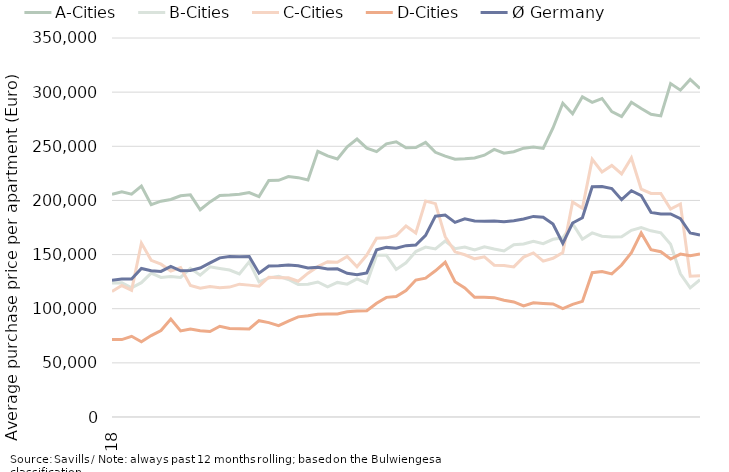
| Category | A-Cities | B-Cities | C-Cities | D-Cities | Ø Germany |
|---|---|---|---|---|---|
| 2018-12-31 | 205709.926 | 123816.667 | 115962.181 | 71467.809 | 126374.246 |
| 2019-01-31 | 207970.964 | 123948.37 | 121373.183 | 71491.123 | 127356.534 |
| 2019-02-28 | 205838.69 | 119321.336 | 117072.458 | 74553.964 | 127352.545 |
| 2019-03-31 | 213204.439 | 124066.253 | 160598.48 | 69477.262 | 137135.806 |
| 2019-04-30 | 196149.545 | 132897.412 | 144733.842 | 75180.853 | 135020.136 |
| 2019-05-31 | 199282.305 | 128866.915 | 141149.327 | 79868.433 | 134421.831 |
| 2019-06-30 | 200854.453 | 129700.035 | 134840.177 | 90421.619 | 138998.232 |
| 2019-07-31 | 204311.167 | 128898.092 | 137923.328 | 79521.239 | 135047.998 |
| 2019-08-31 | 205136.066 | 137236.968 | 121441.752 | 81329.034 | 135243.483 |
| 2019-09-30 | 191410.326 | 130947.49 | 118842.145 | 79686.579 | 137618.907 |
| 2019-10-31 | 198598.97 | 138644.708 | 120512.72 | 78885.294 | 142295.828 |
| 2019-11-30 | 204631.523 | 137216.505 | 119443.727 | 83770.905 | 146967.65 |
| 2019-12-31 | 204917.325 | 135712.797 | 119984.782 | 81747.066 | 148159.063 |
| 2020-01-31 | 205629.747 | 132191.235 | 122679.546 | 81411.791 | 147975.818 |
| 2020-02-29 | 207262.591 | 143343.382 | 121785.051 | 81275.114 | 148179.731 |
| 2020-03-31 | 203578.225 | 124803.659 | 120862.884 | 88906.886 | 132820.36 |
| 2020-04-30 | 218373.684 | 128391.295 | 129104.85 | 87164.683 | 139486.255 |
| 2020-05-31 | 218520.348 | 129898.327 | 128570.848 | 84357.807 | 139761.375 |
| 2020-06-30 | 222001.666 | 127016.066 | 128615.06 | 88580.501 | 140335.937 |
| 2020-07-31 | 221031.697 | 122454.934 | 125354.181 | 92485.072 | 139717.772 |
| 2020-08-31 | 218875.682 | 122654.081 | 132857.027 | 93475.061 | 137648.898 |
| 2020-09-30 | 245365.4 | 124663.85 | 138823.263 | 94907.263 | 138196.049 |
| 2020-10-31 | 241067.064 | 120210.857 | 143383.469 | 95170.767 | 136595.517 |
| 2020-11-30 | 238251.942 | 124288.802 | 142835.305 | 95228.113 | 136885.394 |
| 2020-12-31 | 249571.029 | 122663.257 | 148278.706 | 97223.978 | 132718.397 |
| 2021-01-31 | 256680.188 | 127597.81 | 138739.183 | 97788.194 | 131415.309 |
| 2021-02-28 | 248320.394 | 123624.953 | 149568.467 | 98065.992 | 133064.273 |
| 2021-03-31 | 245061.022 | 149465.306 | 165143.857 | 105089.315 | 154375.165 |
| 2021-04-30 | 252269.878 | 149302.079 | 165442.082 | 110470.059 | 156635.306 |
| 2021-05-31 | 254139.048 | 136241.769 | 167556.146 | 111258.061 | 155851.365 |
| 2021-06-30 | 248621.632 | 142411.274 | 176434.535 | 116777.852 | 158223.002 |
| 2021-07-31 | 248789.853 | 152796.229 | 169920.52 | 126445.429 | 158855.81 |
| 2021-08-31 | 253572.822 | 156946.577 | 199504.328 | 128182.665 | 167764.734 |
| 2021-09-30 | 244426.106 | 155277.206 | 197061.564 | 135035.491 | 185444.246 |
| 2021-10-31 | 240858.098 | 162564.865 | 166482.489 | 142902.828 | 186510.757 |
| 2021-11-30 | 237991.28 | 155446.5 | 152527.17 | 124894.274 | 179769.112 |
| 2021-12-31 | 238498.406 | 157041.296 | 149832.266 | 119262.355 | 182995.149 |
| 2022-01-31 | 239208.121 | 154216.436 | 146078.771 | 110564.847 | 180961.93 |
| 2022-02-28 | 241740.168 | 157265.229 | 147884.541 | 110505.8 | 180735.044 |
| 2022-03-31 | 247145.235 | 155138.135 | 140176.015 | 110215.226 | 181090.941 |
| 2022-04-30 | 243697.345 | 153343.742 | 139922.98 | 107797.862 | 180251.045 |
| 2022-05-31 | 245004.665 | 159010.146 | 138587.104 | 106267.694 | 181224.058 |
| 2022-06-30 | 248259.104 | 159712.858 | 147671.425 | 102668.404 | 182840.443 |
| 2022-07-31 | 249367.736 | 162349.229 | 151546.071 | 105423.106 | 185244.952 |
| 2022-08-31 | 248043.367 | 160044.818 | 143963.04 | 104845.701 | 184401.883 |
| 2022-09-30 | 266951.272 | 164140.818 | 146546.501 | 104351.086 | 178207.601 |
| 2022-10-31 | 289764.583 | 165491.921 | 151839.867 | 100147.155 | 160254.138 |
| 2022-11-30 | 280061.403 | 178480.835 | 198545.4 | 104019.545 | 179121.702 |
| 2022-12-31 | 295678.315 | 164235.058 | 192775.415 | 106761.3 | 183963.595 |
| 2023-01-31 | 290631.981 | 169975.35 | 237937.406 | 133225.038 | 212688.292 |
| 2023-02-28 | 294149.413 | 166970.86 | 226276.195 | 134277.104 | 212829.504 |
| 2023-03-31 | 282010.462 | 166159.228 | 232304.322 | 132080.257 | 210979.676 |
| 2023-04-30 | 277449.586 | 166474.276 | 224433.769 | 140333.949 | 200670.254 |
| 2023-05-31 | 290627.006 | 172354.669 | 239248.629 | 151828.298 | 208935.599 |
| 2023-06-30 | 284915.94 | 174850.194 | 210440.535 | 169985.824 | 204492.945 |
| 2023-07-31 | 279499.206 | 171933.921 | 206443.634 | 154541.407 | 188965.975 |
| 2023-08-31 | 278088.129 | 170053.809 | 206477.932 | 152600.633 | 187470.019 |
| 2023-09-30 | 307939.754 | 159546.039 | 192050.907 | 145933.454 | 187462.827 |
| 2023-10-31 | 301833.075 | 132282.098 | 196752.059 | 150449.68 | 183101.164 |
| 2023-11-30 | 311712.064 | 119309.31 | 130074.981 | 148847.333 | 169897.352 |
| 2023-12-31 | 303402.787 | 126807.259 | 130552.636 | 150602.341 | 168021.722 |